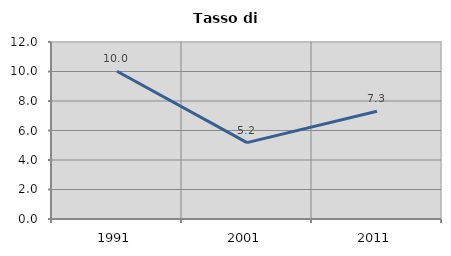
| Category | Tasso di disoccupazione   |
|---|---|
| 1991.0 | 10.015 |
| 2001.0 | 5.177 |
| 2011.0 | 7.305 |